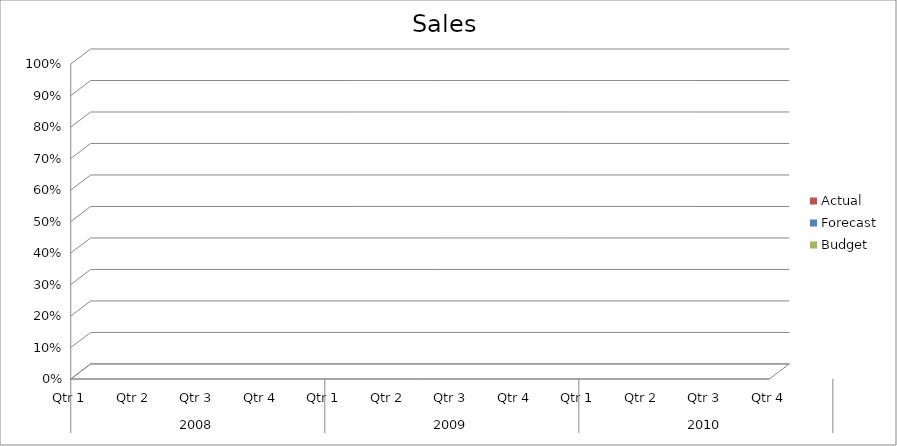
| Category | Budget | Forecast | Actual |
|---|---|---|---|
| 0 | 2960 | 3180 | 1090 |
| 1 | 1300 | 760 | 1810 |
| 2 | 1160 | 1480 | 3230 |
| 3 | 1150 | 2370 | 3050 |
| 4 | 2390 | 1400 | 520 |
| 5 | 3120 | 570 | 2370 |
| 6 | 2400 | 3220 | 2550 |
| 7 | 2240 | 2010 | 1460 |
| 8 | 2070 | 3400 | 2310 |
| 9 | 670 | 2560 | 1450 |
| 10 | 3100 | 2460 | 1730 |
| 11 | 1860 | 2080 | 1540 |